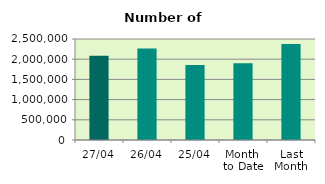
| Category | Series 0 |
|---|---|
| 27/04 | 2086362 |
| 26/04 | 2264186 |
| 25/04 | 1854796 |
| Month 
to Date | 1899144.471 |
| Last
Month | 2375448 |